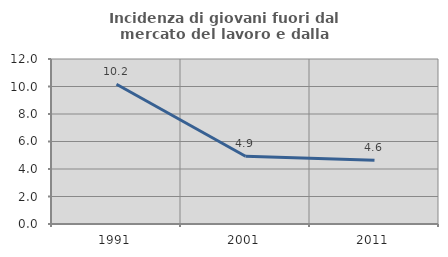
| Category | Incidenza di giovani fuori dal mercato del lavoro e dalla formazione  |
|---|---|
| 1991.0 | 10.164 |
| 2001.0 | 4.93 |
| 2011.0 | 4.63 |